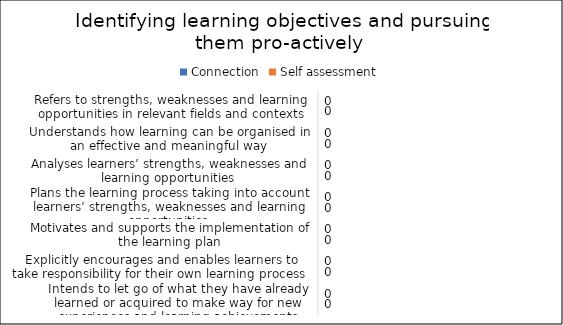
| Category | Connection | Self assessment |
|---|---|---|
| Refers to strengths, weaknesses and learning opportunities in relevant fields and contexts | 0 | 0 |
| Understands how learning can be organised in an effective and meaningful way | 0 | 0 |
| Analyses learners’ strengths, weaknesses and learning opportunities  | 0 | 0 |
| Plans the learning process taking into account learners’ strengths, weaknesses and learning opportunities  | 0 | 0 |
| Motivates and supports the implementation of the learning plan | 0 | 0 |
| Explicitly encourages and enables learners to take responsibility for their own learning process  | 0 | 0 |
| Intends to let go of what they have already learned or acquired to make way for new experiences and learning achievements | 0 | 0 |